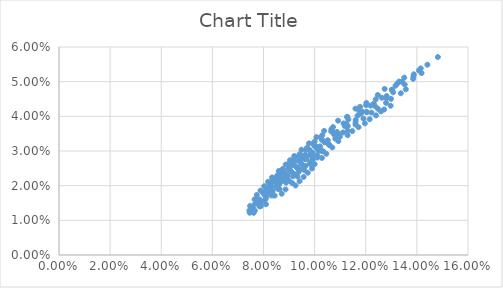
| Category | Series 0 |
|---|---|
| 0.07615607549047824 | 0.012 |
| 0.07877305631354622 | 0.015 |
| 0.08311017332157211 | 0.018 |
| 0.08609787702386693 | 0.02 |
| 0.08921966863250613 | 0.023 |
| 0.09302939523460013 | 0.025 |
| 0.09638145663905891 | 0.028 |
| 0.10099290179946921 | 0.031 |
| 0.10512544275322815 | 0.033 |
| 0.10875722411051683 | 0.036 |
| 0.1124574150636154 | 0.038 |
| 0.11803690576881035 | 0.041 |
| 0.12186609241971104 | 0.043 |
| 0.12632478325449656 | 0.045 |
| 0.13024667437498788 | 0.048 |
| 0.1342095482132134 | 0.05 |
| 0.13878760874879983 | 0.052 |
| 0.14412217252598514 | 0.055 |
| 0.14819266356831606 | 0.057 |
| 0.08097337718755643 | 0.015 |
| 0.08435692249026934 | 0.017 |
| 0.08628204421536413 | 0.019 |
| 0.08992803754422529 | 0.021 |
| 0.09202136885164423 | 0.023 |
| 0.09529822361594435 | 0.026 |
| 0.09926288868203718 | 0.028 |
| 0.10156602483688142 | 0.03 |
| 0.10510168790048481 | 0.032 |
| 0.10930070131180936 | 0.035 |
| 0.11298213429074667 | 0.037 |
| 0.11607830250839533 | 0.039 |
| 0.12045330586945611 | 0.041 |
| 0.12362184810582243 | 0.043 |
| 0.12808546110236382 | 0.045 |
| 0.13072374399813202 | 0.047 |
| 0.13526004393499896 | 0.049 |
| 0.13853918422230624 | 0.051 |
| 0.14183750156328812 | 0.052 |
| 0.08712487427265074 | 0.018 |
| 0.08861494180642851 | 0.019 |
| 0.09120997229064116 | 0.021 |
| 0.09327830659351849 | 0.023 |
| 0.0960080313862439 | 0.024 |
| 0.09819898181985891 | 0.026 |
| 0.10104349615868038 | 0.028 |
| 0.1033402175334671 | 0.03 |
| 0.10568549681533479 | 0.032 |
| 0.10987419220859852 | 0.034 |
| 0.11291344264698937 | 0.036 |
| 0.11598921567261043 | 0.038 |
| 0.11909868168602519 | 0.039 |
| 0.12223926951434388 | 0.041 |
| 0.1247502536876038 | 0.042 |
| 0.12793763633811828 | 0.044 |
| 0.12987597506570397 | 0.045 |
| 0.1337075646281723 | 0.047 |
| 0.1356709650584211 | 0.048 |
| 0.09255218081299263 | 0.02 |
| 0.09411073083720568 | 0.021 |
| 0.09569845074652779 | 0.023 |
| 0.09731391279235863 | 0.024 |
| 0.09895575830507544 | 0.025 |
| 0.10001065116273306 | 0.026 |
| 0.10286109193659451 | 0.028 |
| 0.10458569473592798 | 0.029 |
| 0.1069069420924416 | 0.031 |
| 0.10927411507333927 | 0.033 |
| 0.1128984049999886 | 0.035 |
| 0.11472688137581337 | 0.036 |
| 0.1171821380484648 | 0.037 |
| 0.11965420672693829 | 0.038 |
| 0.12152673349474503 | 0.039 |
| 0.1240273647004384 | 0.04 |
| 0.12592589201757284 | 0.041 |
| 0.12718735284345575 | 0.042 |
| 0.12971995708438538 | 0.043 |
| 0.07586856253970285 | 0.013 |
| 0.0785499717854709 | 0.016 |
| 0.07988703754241198 | 0.018 |
| 0.08235266802061467 | 0.02 |
| 0.08334210278234908 | 0.021 |
| 0.0848897416982496 | 0.022 |
| 0.08647005681799909 | 0.024 |
| 0.08755402419891237 | 0.025 |
| 0.08919274431758646 | 0.026 |
| 0.09085936636077485 | 0.027 |
| 0.09420904170738646 | 0.029 |
| 0.09708507676079307 | 0.031 |
| 0.10001312876279563 | 0.033 |
| 0.10298876115988298 | 0.035 |
| 0.10720736036121767 | 0.037 |
| 0.11271944061352153 | 0.04 |
| 0.11776852343192719 | 0.043 |
| 0.12472068545098315 | 0.046 |
| 0.13505756763531307 | 0.051 |
| 0.07918571236526259 | 0.015 |
| 0.0810204564720477 | 0.017 |
| 0.08294011649635302 | 0.019 |
| 0.08548271588683937 | 0.021 |
| 0.0870392755814382 | 0.022 |
| 0.08862740322943863 | 0.023 |
| 0.09024543225973282 | 0.025 |
| 0.09189178317672934 | 0.026 |
| 0.09468900734764799 | 0.028 |
| 0.09640017137176035 | 0.029 |
| 0.1004522788283024 | 0.031 |
| 0.10284544650974121 | 0.033 |
| 0.10704163382901459 | 0.036 |
| 0.11131094612843272 | 0.038 |
| 0.11754827365109932 | 0.041 |
| 0.12390660744648908 | 0.045 |
| 0.13164586461923233 | 0.049 |
| 0.1415205185641753 | 0.054 |
| 0.07652800011801408 | 0.013 |
| 0.0806918294873498 | 0.016 |
| 0.08255825706913177 | 0.018 |
| 0.08505938304839948 | 0.02 |
| 0.08764289294577907 | 0.022 |
| 0.08921966863250613 | 0.023 |
| 0.09082655002246673 | 0.024 |
| 0.09302939523460013 | 0.025 |
| 0.09469269568050556 | 0.026 |
| 0.09638145663905891 | 0.028 |
| 0.09809436315911968 | 0.029 |
| 0.10099290179946921 | 0.031 |
| 0.10394024027878047 | 0.033 |
| 0.10755400337987493 | 0.035 |
| 0.11181553723398946 | 0.037 |
| 0.1167974906877044 | 0.04 |
| 0.12312151171963835 | 0.044 |
| 0.13024667437498788 | 0.048 |
| 0.14079982060081633 | 0.053 |
| 0.07891316819823546 | 0.014 |
| 0.08322238550693387 | 0.017 |
| 0.08571150276857493 | 0.019 |
| 0.0888587336771594 | 0.021 |
| 0.09151012595600586 | 0.023 |
| 0.09370700384365319 | 0.024 |
| 0.0942299154160143 | 0.025 |
| 0.09647124512382929 | 0.026 |
| 0.09814968413792585 | 0.027 |
| 0.09929423400771525 | 0.028 |
| 0.10100835160064654 | 0.029 |
| 0.10274468166324353 | 0.03 |
| 0.10568549681533479 | 0.032 |
| 0.10807617289527215 | 0.034 |
| 0.11110113523504775 | 0.035 |
| 0.11602723839828927 | 0.038 |
| 0.12045330586945611 | 0.041 |
| 0.12817704228988083 | 0.046 |
| 0.07446614987493345 | 0.013 |
| 0.07475477381057687 | 0.014 |
| 0.0765102812641472 | 0.016 |
| 0.07740217052859845 | 0.017 |
| 0.078828948914367 | 0.019 |
| 0.0802953965209094 | 0.02 |
| 0.08179937988185981 | 0.021 |
| 0.0833388668435326 | 0.022 |
| 0.08596704605826724 | 0.024 |
| 0.08866929848743521 | 0.026 |
| 0.09033426068551265 | 0.027 |
| 0.09202582867892548 | 0.029 |
| 0.09487347092785486 | 0.03 |
| 0.09777598392654248 | 0.032 |
| 0.10072862445580165 | 0.034 |
| 0.10372711189347636 | 0.036 |
| 0.10917916760776945 | 0.039 |
| 0.11597267200164325 | 0.042 |
| 0.07459671330335449 | 0.012 |
| 0.07667137235587924 | 0.015 |
| 0.07751684210248344 | 0.016 |
| 0.07988703754241198 | 0.018 |
| 0.08082723577111063 | 0.019 |
| 0.08232084405873377 | 0.02 |
| 0.08385011044588173 | 0.022 |
| 0.0854131196487477 | 0.023 |
| 0.08753719397889197 | 0.024 |
| 0.09025628852800331 | 0.026 |
| 0.09192587094990792 | 0.027 |
| 0.09362144098468346 | 0.028 |
| 0.09648172032455948 | 0.03 |
| 0.0993952499195708 | 0.032 |
| 0.10235748268402634 | 0.034 |
| 0.10656051988303182 | 0.036 |
| 0.11271944061352153 | 0.04 |
| 0.12026037081303788 | 0.044 |
| 0.13306003182947443 | 0.05 |
| 0.0760024876271865 | 0.013 |
| 0.07812448372727962 | 0.015 |
| 0.08048463417644752 | 0.017 |
| 0.08139974617624975 | 0.019 |
| 0.08288238340708168 | 0.02 |
| 0.08440083300548414 | 0.021 |
| 0.08649346123482175 | 0.022 |
| 0.08807982339103942 | 0.024 |
| 0.08969633254439295 | 0.025 |
| 0.09134138813447318 | 0.026 |
| 0.09301347553903781 | 0.027 |
| 0.09471116306154424 | 0.028 |
| 0.09813469467842206 | 0.03 |
| 0.09989136043647623 | 0.031 |
| 0.10284544650974121 | 0.033 |
| 0.10647818411332863 | 0.036 |
| 0.11318553844670459 | 0.039 |
| 0.12014273472063401 | 0.043 |
| 0.1323511059897639 | 0.049 |
| 0.07837082995310664 | 0.014 |
| 0.08112212524916342 | 0.017 |
| 0.08356643592946998 | 0.018 |
| 0.08505938304839948 | 0.02 |
| 0.08658688356959748 | 0.021 |
| 0.08870898966355684 | 0.022 |
| 0.08921966863250613 | 0.023 |
| 0.09082655002246673 | 0.024 |
| 0.09302939523460013 | 0.025 |
| 0.09469269568050556 | 0.026 |
| 0.09638145663905891 | 0.028 |
| 0.09694979919482824 | 0.028 |
| 0.09924597971143474 | 0.03 |
| 0.10216207221345729 | 0.031 |
| 0.10394024027878047 | 0.033 |
| 0.10755400337987493 | 0.035 |
| 0.11181553723398946 | 0.037 |
| 0.1186992327284119 | 0.041 |
| 0.13024667437498788 | 0.048 |
| 0.07652800011801408 | 0.013 |
| 0.1386579884865655 | 0.051 |
| 0.12738991357986285 | 0.048 |